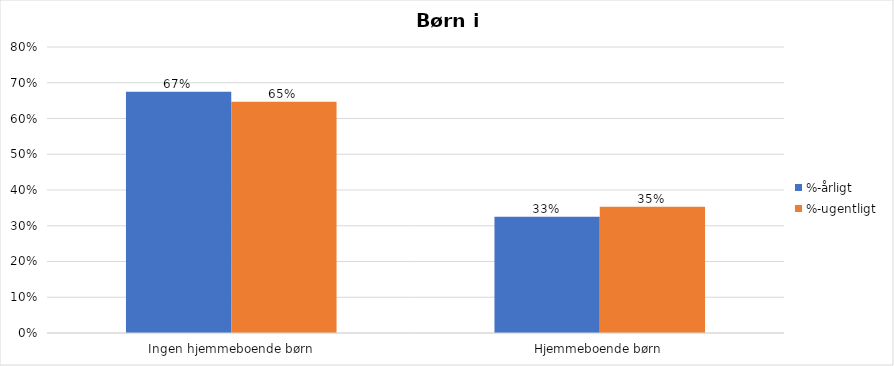
| Category | %-årligt | %-ugentligt |
|---|---|---|
| Ingen hjemmeboende børn | 0.675 | 0.647 |
| Hjemmeboende børn | 0.325 | 0.353 |